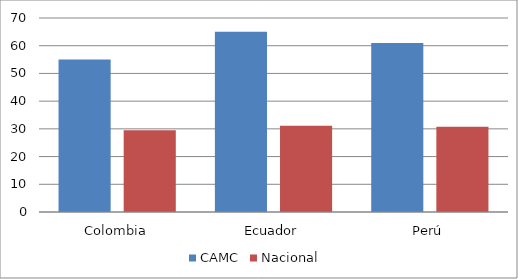
| Category | CAMC | Nacional  |
|---|---|---|
| Colombia | 55 | 29.526 |
| Ecuador | 65 | 31.088 |
| Perú | 61 | 30.787 |